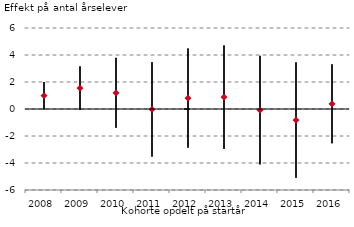
| Category | Serie 1 | Serie 2 | Serie 3 |
|---|---|---|---|
| 2008.0 | 1.994 | -0.027 | 0.983 |
| 2009.0 | 3.154 | -0.067 | 1.544 |
| 2010.0 | 3.79 | -1.391 | 1.199 |
| 2011.0 | 3.472 | -3.524 | -0.026 |
| 2012.0 | 4.482 | -2.865 | 0.808 |
| 2013.0 | 4.706 | -2.959 | 0.874 |
| 2014.0 | 3.941 | -4.103 | -0.081 |
| 2015.0 | 3.455 | -5.094 | -0.82 |
| 2016.0 | 3.308 | -2.541 | 0.383 |